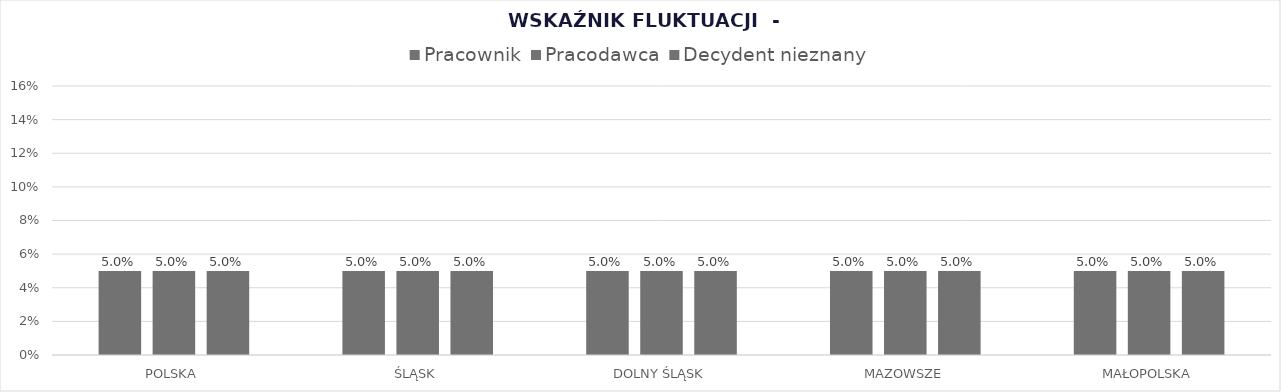
| Category | Pracownik | Pracodawca | Decydent nieznany |
|---|---|---|---|
| POLSKA | 0.05 | 0.05 | 0.05 |
| ŚLĄSK | 0.05 | 0.05 | 0.05 |
| DOLNY ŚLĄSK | 0.05 | 0.05 | 0.05 |
| MAZOWSZE | 0.05 | 0.05 | 0.05 |
| MAŁOPOLSKA | 0.05 | 0.05 | 0.05 |